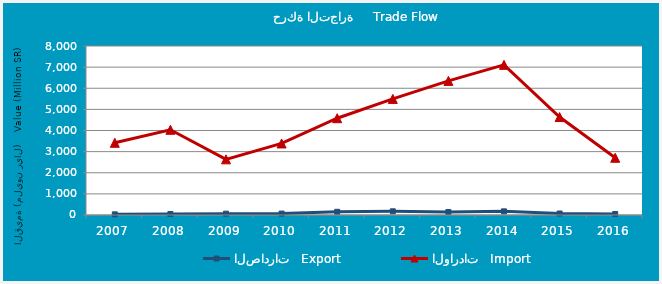
| Category | الصادرات   Export | الواردات   Import |
|---|---|---|
| 2007.0 | 30.816 | 3418.014 |
| 2008.0 | 48.218 | 4033.227 |
| 2009.0 | 63.257 | 2633.97 |
| 2010.0 | 67.32 | 3386.404 |
| 2011.0 | 151.148 | 4581.793 |
| 2012.0 | 174.336 | 5495.31 |
| 2013.0 | 143.418 | 6347.571 |
| 2014.0 | 172.575 | 7107.332 |
| 2015.0 | 70.342 | 4635.546 |
| 2016.0 | 47.389 | 2709.341 |